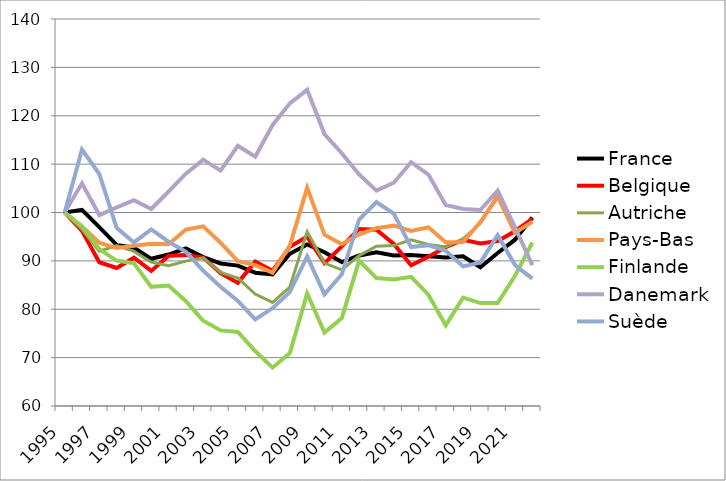
| Category | France | Belgique | Autriche | Pays-Bas | Finlande | Danemark | Suède |
|---|---|---|---|---|---|---|---|
| 1995 | 100 | 100 | 100 | 100 | 100 | 100 | 100 |
| 1996 | 100.541 | 96.211 | 96.524 | 97.093 | 97.127 | 106.029 | 112.991 |
| 1997 | 96.987 | 89.721 | 92.005 | 93.776 | 92.443 | 99.471 | 107.966 |
| 1998 | 93.291 | 88.53 | 93.169 | 92.65 | 90.057 | 101.068 | 96.849 |
| 1999 | 92.734 | 90.642 | 91.961 | 93.118 | 89.506 | 102.554 | 93.805 |
| 2000 | 90.426 | 87.924 | 89.741 | 93.555 | 84.635 | 100.723 | 96.508 |
| 2001 | 91.314 | 91.067 | 88.982 | 93.425 | 84.906 | 104.338 | 93.958 |
| 2002 | 92.576 | 91.227 | 89.944 | 96.476 | 81.668 | 108.03 | 91.881 |
| 2003 | 90.8 | 90.684 | 90.62 | 97.137 | 77.629 | 110.937 | 87.962 |
| 2004 | 89.464 | 87.478 | 87.59 | 93.763 | 75.625 | 108.668 | 84.658 |
| 2005 | 89.021 | 85.451 | 86.447 | 89.948 | 75.321 | 113.799 | 81.706 |
| 2006 | 87.562 | 89.846 | 83.151 | 89.122 | 71.366 | 111.557 | 77.909 |
| 2007 | 87.18 | 87.945 | 81.419 | 87.564 | 67.921 | 118.052 | 80.221 |
| 2008 | 91.479 | 92.933 | 84.586 | 93.142 | 70.945 | 122.562 | 83.538 |
| 2009 | 93.379 | 94.988 | 96.005 | 105.084 | 83.288 | 125.359 | 90.939 |
| 2010 | 91.799 | 89.536 | 89.551 | 95.421 | 75.173 | 116.213 | 83.069 |
| 2011 | 89.749 | 92.993 | 88.147 | 93.439 | 78.17 | 112.252 | 87.241 |
| 2012 | 91.104 | 96.605 | 91.092 | 95.501 | 90.055 | 107.861 | 98.558 |
| 2013 | 91.767 | 96.433 | 93.013 | 96.764 | 86.449 | 104.513 | 102.14 |
| 2014 | 91.134 | 93.505 | 93.164 | 97.32 | 86.167 | 106.157 | 99.769 |
| 2015 | 91.233 | 89.09 | 94.361 | 96.174 | 86.713 | 110.409 | 92.859 |
| 2016 | 90.977 | 90.832 | 93.389 | 96.929 | 83.007 | 107.831 | 93.25 |
| 2017 | 90.694 | 92.832 | 92.862 | 93.842 | 76.668 | 101.538 | 92.092 |
| 2018 | 90.938 | 94.347 | 94.565 | 93.889 | 82.413 | 100.723 | 88.87 |
| 2019 | 88.69 | 93.614 | 97.771 | 98.022 | 81.277 | 100.518 | 89.688 |
| 2020 | 91.628 | 94.118 | 103.663 | 103.256 | 81.282 | 104.53 | 95.321 |
| 2021 | 94.375 | 96.133 | 95.926 | 95.813 | 86.91 | 96.941 | 89.138 |
| 2022 | 98.953 | 98.681 | 98.099 | 98.058 | 93.792 | 89.107 | 86.337 |